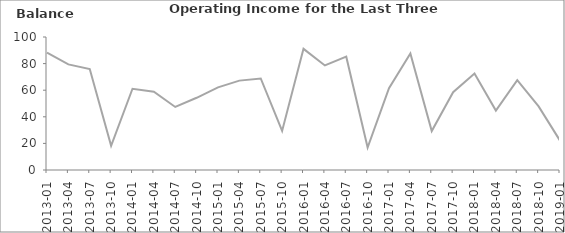
| Category | Balance |
|---|---|
| 2013-01 | 88.2 |
| 2013-04 | 79.4 |
| 2013-07 | 75.9 |
| 2013-10 | 18.2 |
| 2014-01 | 61.1 |
| 2014-04 | 58.8 |
| 2014-07 | 47.4 |
| 2014-10 | 54.3 |
| 2015-01 | 62.1 |
| 2015-04 | 67.2 |
| 2015-07 | 68.8 |
| 2015-10 | 29.4 |
| 2016-01 | 91.1 |
| 2016-04 | 78.6 |
| 2016-07 | 85.2 |
| 2016-10 | 16.9 |
| 2017-01 | 61.5 |
| 2017-04 | 87.6 |
| 2017-07 | 29.3 |
| 2017-10 | 58.5 |
| 2018-01 | 72.6 |
| 2018-04 | 44.7 |
| 2018-07 | 67.6 |
| 2018-10 | 47.8 |
| 2019-01 | 22.1 |